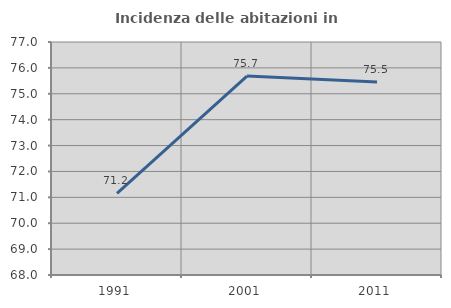
| Category | Incidenza delle abitazioni in proprietà  |
|---|---|
| 1991.0 | 71.151 |
| 2001.0 | 75.686 |
| 2011.0 | 75.452 |